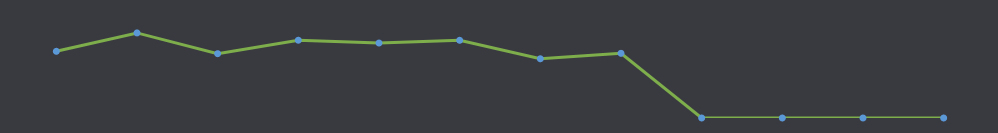
| Category | Razpoložljiva sredstva |
|---|---|
| JAN | 1295 |
| FEB | 1652 |
| MAR | 1249 |
| APR | 1510 |
| MAJ | 1456 |
| JUN | 1509 |
| JUL | 1150 |
| AVG | 1256 |
| SEP | 0 |
| OKT | 0 |
| NOV | 0 |
| DEC | 0 |